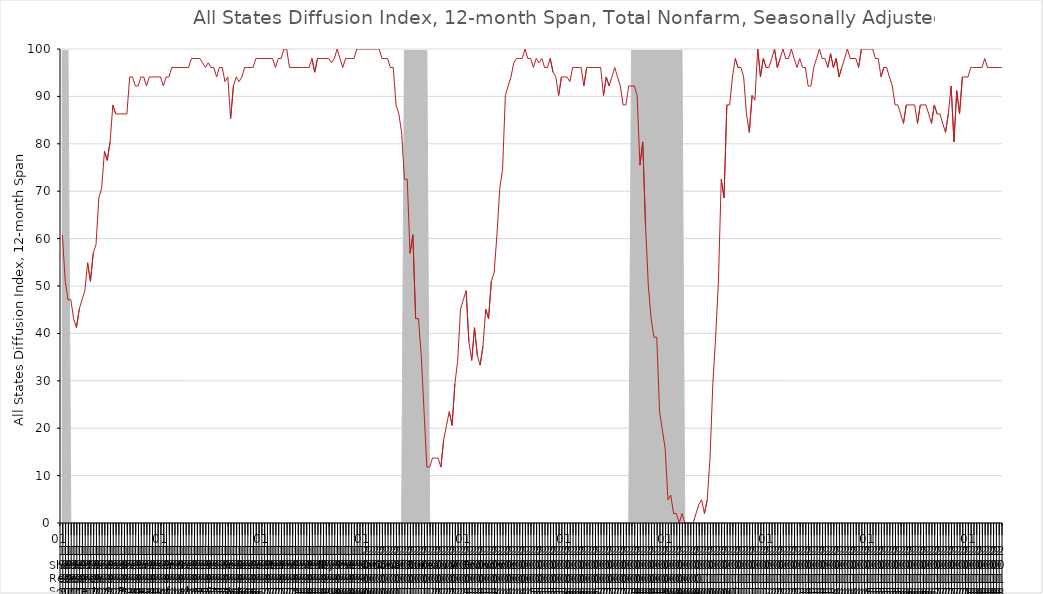
| Category | DI_12month |
|---|---|
| 1991 | 60.8 |
| 1991 | 51 |
| 1991 | 47.1 |
| 1991 | 47.1 |
| 1991 | 43.1 |
| 1991 | 41.2 |
| 1991 | 45.1 |
| 1991 | 47.1 |
| 1991 | 49 |
| 1991 | 54.9 |
| 1991 | 51 |
| 1991 | 56.9 |
| 1992 | 58.8 |
| 1992 | 68.6 |
| 1992 | 70.6 |
| 1992 | 78.4 |
| 1992 | 76.5 |
| 1992 | 80.4 |
| 1992 | 88.2 |
| 1992 | 86.3 |
| 1992 | 86.3 |
| 1992 | 86.3 |
| 1992 | 86.3 |
| 1992 | 86.3 |
| 1993 | 94.1 |
| 1993 | 94.1 |
| 1993 | 92.2 |
| 1993 | 92.2 |
| 1993 | 94.1 |
| 1993 | 94.1 |
| 1993 | 92.2 |
| 1993 | 94.1 |
| 1993 | 94.1 |
| 1993 | 94.1 |
| 1993 | 94.1 |
| 1993 | 94.1 |
| 1994 | 92.2 |
| 1994 | 94.1 |
| 1994 | 94.1 |
| 1994 | 96.1 |
| 1994 | 96.1 |
| 1994 | 96.1 |
| 1994 | 96.1 |
| 1994 | 96.1 |
| 1994 | 96.1 |
| 1994 | 96.1 |
| 1994 | 98 |
| 1994 | 98 |
| 1995 | 98 |
| 1995 | 98 |
| 1995 | 97.1 |
| 1995 | 96.1 |
| 1995 | 97.1 |
| 1995 | 96.1 |
| 1995 | 96.1 |
| 1995 | 94.1 |
| 1995 | 96.1 |
| 1995 | 96.1 |
| 1995 | 93.1 |
| 1995 | 94.1 |
| 1996 | 85.3 |
| 1996 | 92.2 |
| 1996 | 94.1 |
| 1996 | 93.1 |
| 1996 | 94.1 |
| 1996 | 96.1 |
| 1996 | 96.1 |
| 1996 | 96.1 |
| 1996 | 96.1 |
| 1996 | 98 |
| 1996 | 98 |
| 1996 | 98 |
| 1997 | 98 |
| 1997 | 98 |
| 1997 | 98 |
| 1997 | 98 |
| 1997 | 96.1 |
| 1997 | 98 |
| 1997 | 98 |
| 1997 | 100 |
| 1997 | 100 |
| 1997 | 96.1 |
| 1997 | 96.1 |
| 1997 | 96.1 |
| 1998 | 96.1 |
| 1998 | 96.1 |
| 1998 | 96.1 |
| 1998 | 96.1 |
| 1998 | 96.1 |
| 1998 | 98 |
| 1998 | 95.1 |
| 1998 | 98 |
| 1998 | 98 |
| 1998 | 98 |
| 1998 | 98 |
| 1998 | 98 |
| 1999 | 97.1 |
| 1999 | 98 |
| 1999 | 100 |
| 1999 | 98 |
| 1999 | 96.1 |
| 1999 | 98 |
| 1999 | 98 |
| 1999 | 98 |
| 1999 | 98 |
| 1999 | 100 |
| 1999 | 100 |
| 1999 | 100 |
| 2000 | 100 |
| 2000 | 100 |
| 2000 | 100 |
| 2000 | 100 |
| 2000 | 100 |
| 2000 | 100 |
| 2000 | 98 |
| 2000 | 98 |
| 2000 | 98 |
| 2000 | 96.1 |
| 2000 | 96.1 |
| 2000 | 88.2 |
| 2001 | 86.3 |
| 2001 | 82.4 |
| 2001 | 72.5 |
| 2001 | 72.5 |
| 2001 | 56.9 |
| 2001 | 60.8 |
| 2001 | 43.1 |
| 2001 | 43.1 |
| 2001 | 35.3 |
| 2001 | 23.5 |
| 2001 | 11.8 |
| 2001 | 11.8 |
| 2002 | 13.7 |
| 2002 | 13.7 |
| 2002 | 13.7 |
| 2002 | 11.8 |
| 2002 | 17.6 |
| 2002 | 20.6 |
| 2002 | 23.5 |
| 2002 | 20.6 |
| 2002 | 29.4 |
| 2002 | 34.3 |
| 2002 | 45.1 |
| 2002 | 47.1 |
| 2003 | 49 |
| 2003 | 38.2 |
| 2003 | 34.3 |
| 2003 | 41.2 |
| 2003 | 35.3 |
| 2003 | 33.3 |
| 2003 | 37.3 |
| 2003 | 45.1 |
| 2003 | 43.1 |
| 2003 | 51 |
| 2003 | 52.9 |
| 2003 | 60.8 |
| 2004 | 70.6 |
| 2004 | 74.5 |
| 2004 | 90.2 |
| 2004 | 92.2 |
| 2004 | 94.1 |
| 2004 | 97.1 |
| 2004 | 98 |
| 2004 | 98 |
| 2004 | 98 |
| 2004 | 100 |
| 2004 | 98 |
| 2004 | 98 |
| 2005 | 96.1 |
| 2005 | 98 |
| 2005 | 97.1 |
| 2005 | 98 |
| 2005 | 96.1 |
| 2005 | 96.1 |
| 2005 | 98 |
| 2005 | 95.1 |
| 2005 | 94.1 |
| 2005 | 90.2 |
| 2005 | 94.1 |
| 2005 | 94.1 |
| 2006 | 94.1 |
| 2006 | 93.1 |
| 2006 | 96.1 |
| 2006 | 96.1 |
| 2006 | 96.1 |
| 2006 | 96.1 |
| 2006 | 92.2 |
| 2006 | 96.1 |
| 2006 | 96.1 |
| 2006 | 96.1 |
| 2006 | 96.1 |
| 2006 | 96.1 |
| 2007 | 96.1 |
| 2007 | 90.2 |
| 2007 | 94.1 |
| 2007 | 92.2 |
| 2007 | 94.1 |
| 2007 | 96.1 |
| 2007 | 94.1 |
| 2007 | 92.2 |
| 2007 | 88.2 |
| 2007 | 88.2 |
| 2007 | 92.2 |
| 2007 | 92.2 |
| 2008 | 92.2 |
| 2008 | 90.2 |
| 2008 | 75.5 |
| 2008 | 80.4 |
| 2008 | 62.7 |
| 2008 | 50 |
| 2008 | 43.1 |
| 2008 | 39.2 |
| 2008 | 39.2 |
| 2008 | 23.5 |
| 2008 | 19.6 |
| 2008 | 15.7 |
| 2009 | 4.9 |
| 2009 | 5.9 |
| 2009 | 2 |
| 2009 | 2 |
| 2009 | 0 |
| 2009 | 2 |
| 2009 | 0 |
| 2009 | 0 |
| 2009 | 0 |
| 2009 | 0 |
| 2009 | 2 |
| 2009 | 3.9 |
| 2010 | 4.9 |
| 2010 | 2 |
| 2010 | 4.9 |
| 2010 | 13.7 |
| 2010 | 29.4 |
| 2010 | 39.2 |
| 2010 | 51 |
| 2010 | 72.5 |
| 2010 | 68.6 |
| 2010 | 88.2 |
| 2010 | 88.2 |
| 2010 | 94.1 |
| 2011 | 98 |
| 2011 | 96.1 |
| 2011 | 96.1 |
| 2011 | 94.1 |
| 2011 | 86.3 |
| 2011 | 82.4 |
| 2011 | 90.2 |
| 2011 | 89.2 |
| 2011 | 100 |
| 2011 | 94.1 |
| 2011 | 98 |
| 2011 | 96.1 |
| 2012 | 96.1 |
| 2012 | 98 |
| 2012 | 100 |
| 2012 | 96.1 |
| 2012 | 98 |
| 2012 | 100 |
| 2012 | 98 |
| 2012 | 98 |
| 2012 | 100 |
| 2012 | 98 |
| 2012 | 96.1 |
| 2012 | 98 |
| 2013 | 96.1 |
| 2013 | 96.1 |
| 2013 | 92.2 |
| 2013 | 92.2 |
| 2013 | 96.1 |
| 2013 | 98 |
| 2013 | 100 |
| 2013 | 98 |
| 2013 | 98 |
| 2013 | 96.1 |
| 2013 | 99 |
| 2013 | 96.1 |
| 2014 | 98 |
| 2014 | 94.1 |
| 2014 | 96.1 |
| 2014 | 98 |
| 2014 | 100 |
| 2014 | 98 |
| 2014 | 98 |
| 2014 | 98 |
| 2014 | 96.1 |
| 2014 | 100 |
| 2014 | 100 |
| 2014 | 100 |
| 2015 | 100 |
| 2015 | 100 |
| 2015 | 98 |
| 2015 | 98 |
| 2015 | 94.1 |
| 2015 | 96.1 |
| 2015 | 96.1 |
| 2015 | 94.1 |
| 2015 | 92.2 |
| 2015 | 88.2 |
| 2015 | 88.2 |
| 2015 | 86.3 |
| 2016 | 84.3 |
| 2016 | 88.2 |
| 2016 | 88.2 |
| 2016 | 88.2 |
| 2016 | 88.2 |
| 2016 | 84.3 |
| 2016 | 88.2 |
| 2016 | 88.2 |
| 2016 | 88.2 |
| 2016 | 86.3 |
| 2016 | 84.3 |
| 2016 | 88.2 |
| 2017 | 86.3 |
| 2017 | 86.3 |
| 2017 | 84.3 |
| 2017 | 82.4 |
| 2017 | 86.3 |
| 2017 | 92.2 |
| 2017 | 80.4 |
| 2017 | 91.2 |
| 2017 | 86.3 |
| 2017 | 94.1 |
| 2017 | 94.1 |
| 2017 | 94.1 |
| 2018 | 96.1 |
| 2018 | 96.1 |
| 2018 | 96.1 |
| 2018 | 96.1 |
| 2018 | 96.1 |
| 2018 | 98 |
| 2018 | 96.1 |
| 2018 | 96.1 |
| 2018 | 96.1 |